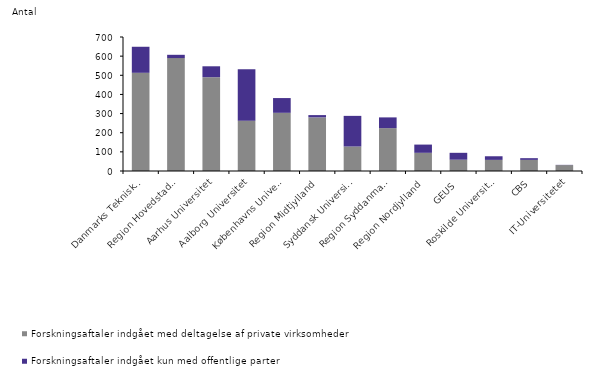
| Category | Forskningsaftaler indgået med deltagelse af private virksomheder | Forskningsaftaler indgået kun med offentlige parter |
|---|---|---|
| Danmarks Tekniske Universitet | 513 | 136 |
| Region Hovedstaden | 590 | 17 |
| Aarhus Universitet | 490 | 57 |
| Aalborg Universitet | 263 | 268 |
| Københavns Universitet | 304 | 77 |
| Region Midtjylland | 280 | 12 |
| Syddansk Universitet | 128 | 160 |
| Region Syddanmark | 224 | 56 |
| Region Nordjylland | 95 | 43 |
| GEUS | 59 | 36 |
| Roskilde Universitet | 58 | 19 |
| CBS | 58 | 9 |
| IT-Universitetet | 31 | 1 |